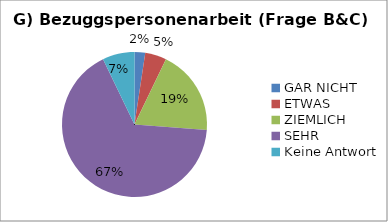
| Category | Series 0 |
|---|---|
| GAR NICHT | 1 |
| ETWAS | 2 |
| ZIEMLICH | 8 |
| SEHR | 28 |
| Keine Antwort | 3 |